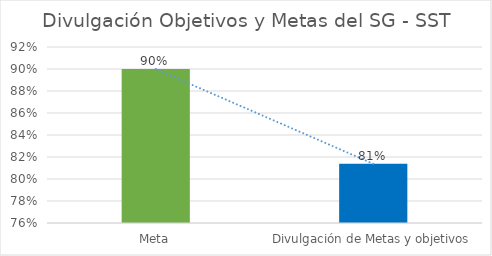
| Category | Series 0 |
|---|---|
| Meta | 0.9 |
| Divulgación de Metas y objetivos | 0.814 |